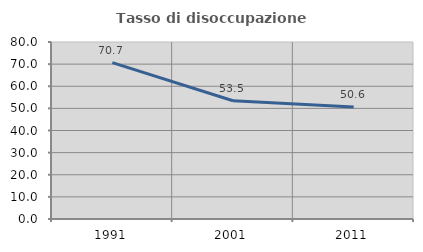
| Category | Tasso di disoccupazione giovanile  |
|---|---|
| 1991.0 | 70.672 |
| 2001.0 | 53.465 |
| 2011.0 | 50.579 |